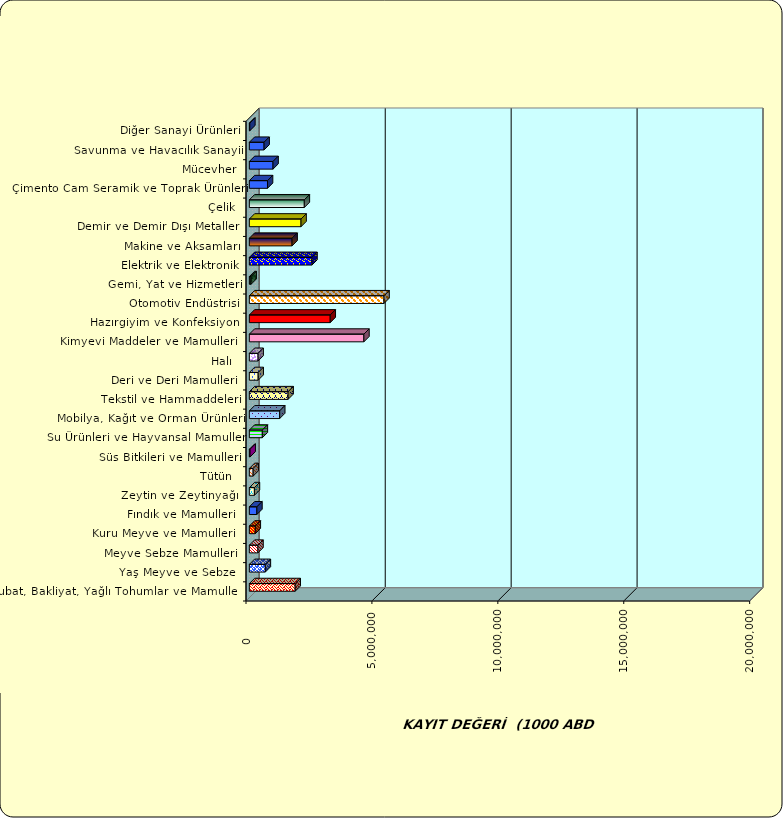
| Category | Series 0 |
|---|---|
|  Hububat, Bakliyat, Yağlı Tohumlar ve Mamulleri  | 1820527.987 |
|  Yaş Meyve ve Sebze   | 634488.344 |
|  Meyve Sebze Mamulleri  | 342074.361 |
|  Kuru Meyve ve Mamulleri   | 235110.818 |
|  Fındık ve Mamulleri  | 299393.425 |
|  Zeytin ve Zeytinyağı  | 201219.942 |
|  Tütün  | 150914.003 |
|  Süs Bitkileri ve Mamulleri | 30145.859 |
|  Su Ürünleri ve Hayvansal Mamuller | 515461.169 |
|  Mobilya, Kağıt ve Orman Ürünleri | 1204674.983 |
|  Tekstil ve Hammaddeleri | 1538451.833 |
|  Deri ve Deri Mamulleri  | 350762.264 |
|  Halı  | 347489.111 |
|  Kimyevi Maddeler ve Mamulleri   | 4548442.724 |
|  Hazırgiyim ve Konfeksiyon  | 3211572.084 |
|  Otomotiv Endüstrisi | 5347174.406 |
|  Gemi, Yat ve Hizmetleri | 69620.665 |
|  Elektrik ve Elektronik | 2486738.436 |
|  Makine ve Aksamları | 1696128.102 |
|  Demir ve Demir Dışı Metaller  | 2052699.297 |
|  Çelik | 2182481.917 |
|  Çimento Cam Seramik ve Toprak Ürünleri | 721080.081 |
|  Mücevher | 940247.686 |
|  Savunma ve Havacılık Sanayii | 584926.722 |
|  Diğer Sanayi Ürünleri | 18303.732 |